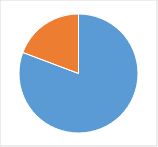
| Category | Series 0 |
|---|---|
| 0 | 0.779 |
| 1 | 0.186 |
| 2 | 0 |